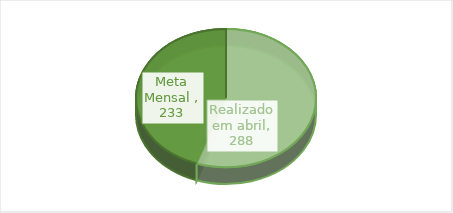
| Category | Series 0 |
|---|---|
| Realizado em abril | 288 |
| Meta Mensal  | 233 |